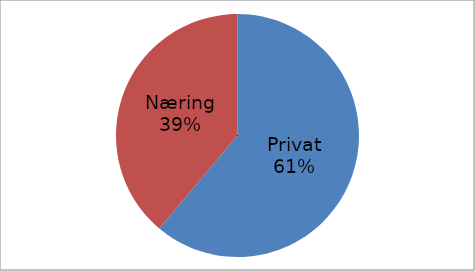
| Category | Series 0 |
|---|---|
| Privat | 49240470 |
| Næring | 31317881 |